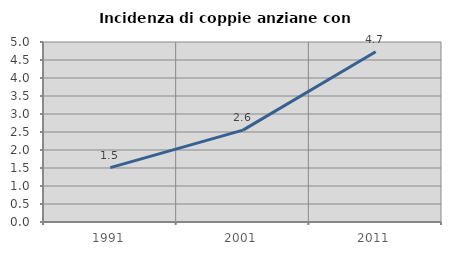
| Category | Incidenza di coppie anziane con figli |
|---|---|
| 1991.0 | 1.512 |
| 2001.0 | 2.552 |
| 2011.0 | 4.728 |